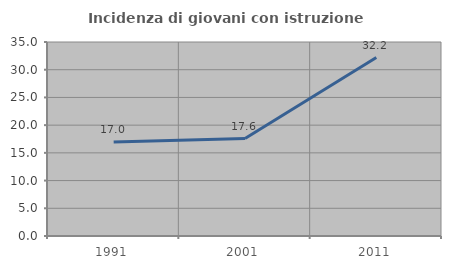
| Category | Incidenza di giovani con istruzione universitaria |
|---|---|
| 1991.0 | 16.981 |
| 2001.0 | 17.582 |
| 2011.0 | 32.203 |